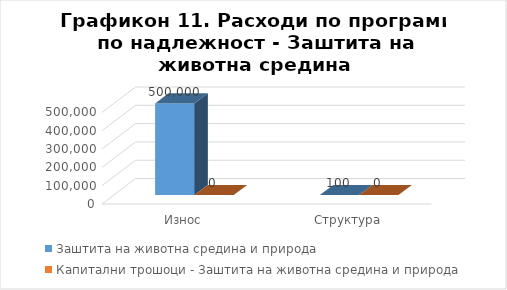
| Category | Заштита на животна средина и природа | Капитални трошоци - Заштита на животна средина и природа |
|---|---|---|
| Износ | 500000 | 0 |
| Структура | 100 | 0 |